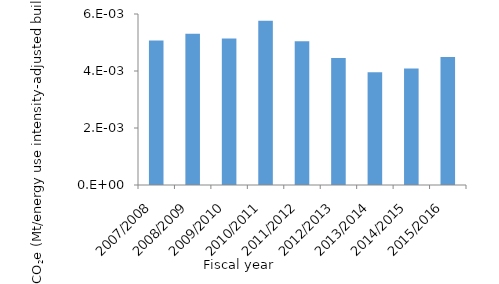
| Category | Series 0 |
|---|---|
| 2007/2008 | 0.005 |
| 2008/2009 | 0.005 |
| 2009/2010 | 0.005 |
| 2010/2011 | 0.006 |
| 2011/2012 | 0.005 |
| 2012/2013 | 0.004 |
| 2013/2014 | 0.004 |
| 2014/2015 | 0.004 |
| 2015/2016 | 0.004 |